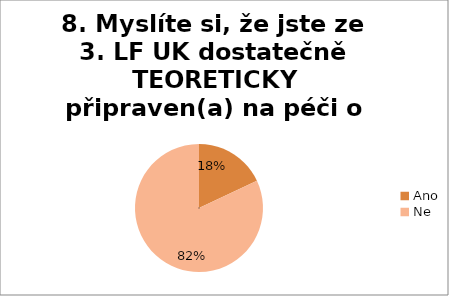
| Category | 8. Myslíte si, že jste ze 3. LF UK dostatečně TEORETICKY připraven(a) na péči o tělo zemřelého?  |
|---|---|
| Ano | 0.18 |
| Ne | 0.82 |